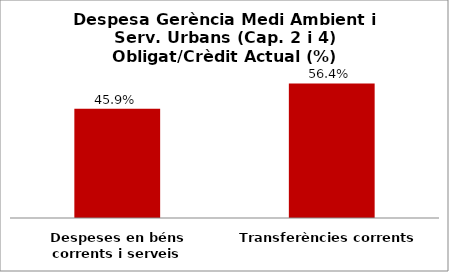
| Category | Series 0 |
|---|---|
| Despeses en béns corrents i serveis | 0.459 |
| Transferències corrents | 0.564 |